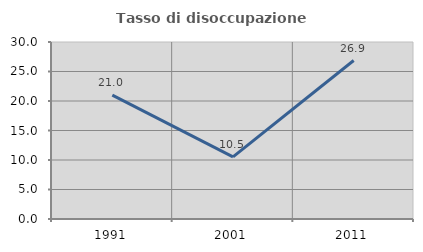
| Category | Tasso di disoccupazione giovanile  |
|---|---|
| 1991.0 | 20.99 |
| 2001.0 | 10.526 |
| 2011.0 | 26.862 |